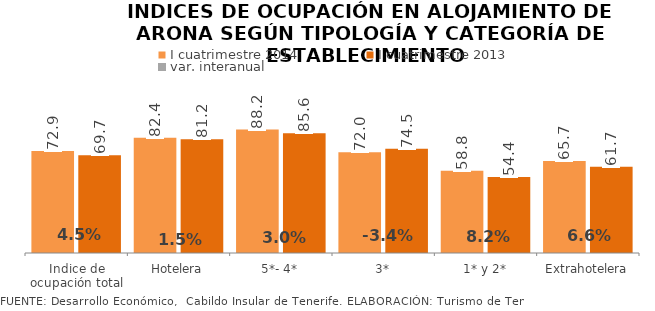
| Category | I cuatrimestre 2014 | I cuatrimestre 2013 |
|---|---|---|
| Indice de ocupación total | 72.866 | 69.743 |
| Hotelera | 82.358 | 81.176 |
| 5*- 4* | 88.155 | 85.583 |
| 3* | 72.007 | 74.54 |
| 1* y 2* | 58.812 | 54.367 |
| Extrahotelera | 65.731 | 61.679 |